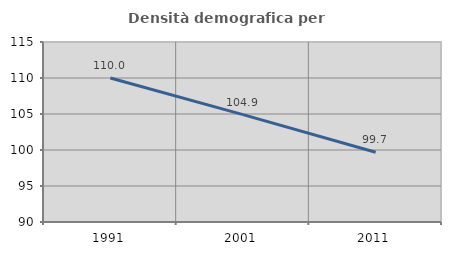
| Category | Densità demografica |
|---|---|
| 1991.0 | 109.992 |
| 2001.0 | 104.906 |
| 2011.0 | 99.692 |